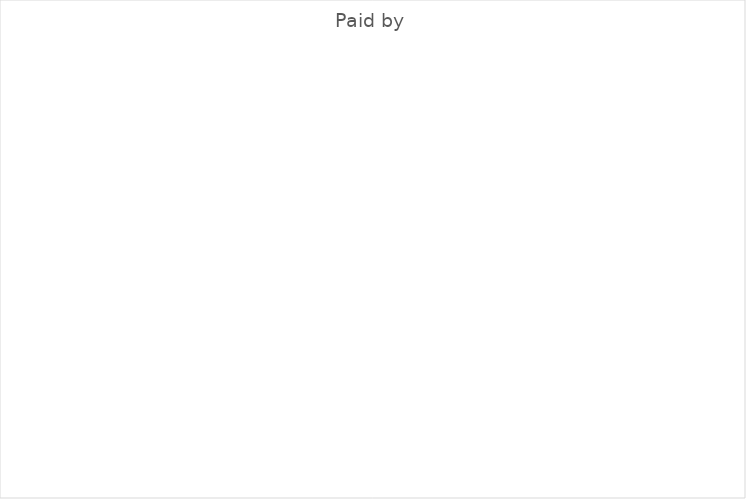
| Category | Series 0 | Series 1 |
|---|---|---|
| Bride | 0 | 0 |
| Groom | 0 | 0 |
| Bride and Groom | 0 | 0 |
| Bride's parents | 0 | 0 |
| Groom's parents | 0 | 0 |